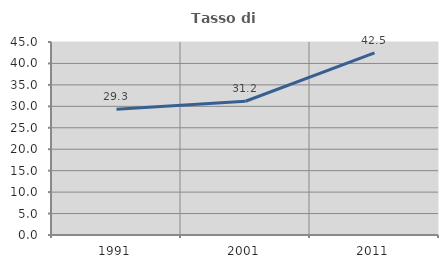
| Category | Tasso di occupazione   |
|---|---|
| 1991.0 | 29.327 |
| 2001.0 | 31.179 |
| 2011.0 | 42.482 |